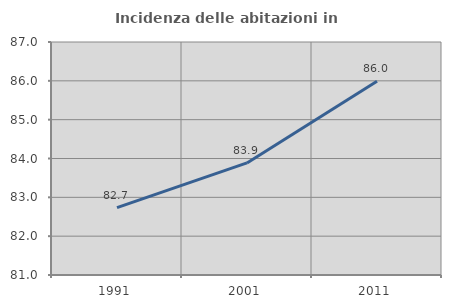
| Category | Incidenza delle abitazioni in proprietà  |
|---|---|
| 1991.0 | 82.735 |
| 2001.0 | 83.886 |
| 2011.0 | 85.991 |